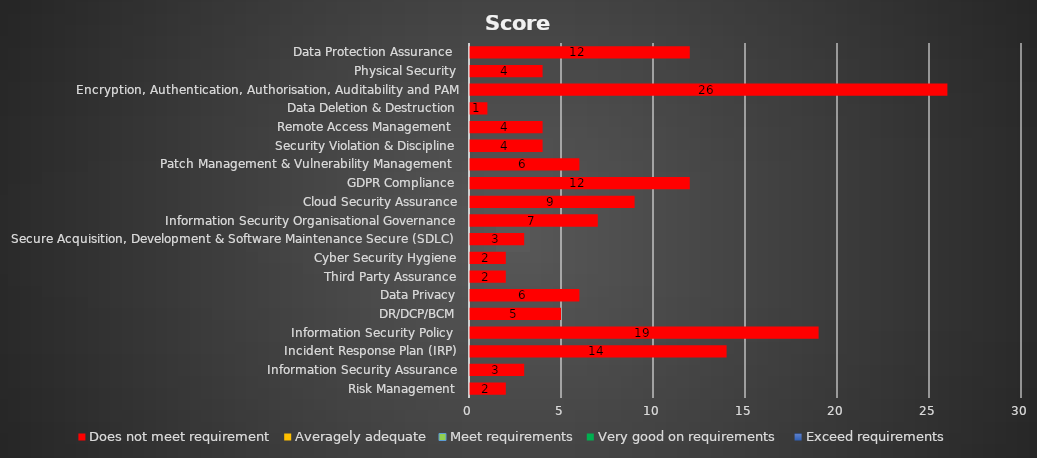
| Category | Does not meet requirement | Averagely adequate | Meet requirements | Very good on requirements  | Exceed requirements  |
|---|---|---|---|---|---|
| Risk Management | 2 | 0 | 0 | 0 | 0 |
| Information Security Assurance | 3 | 0 | 0 | 0 | 0 |
| Incident Response Plan (IRP) | 14 | 0 | 0 | 0 | 0 |
| Information Security Policy  | 19 | 0 | 0 | 0 | 0 |
| DR/DCP/BCM | 5 | 0 | 0 | 0 | 0 |
| Data Privacy | 6 | 0 | 0 | 0 | 0 |
| Third Party Assurance | 2 | 0 | 0 | 0 | 0 |
| Cyber Security Hygiene | 2 | 0 | 0 | 0 | 0 |
| Secure Acquisition, Development & Software Maintenance Secure (SDLC)  | 3 | 0 | 0 | 0 | 0 |
| Information Security Organisational Governance | 7 | 0 | 0 | 0 | 0 |
| Cloud Security Assurance | 9 | 0 | 0 | 0 | 0 |
| GDPR Compliance | 12 | 0 | 0 | 0 | 0 |
| Patch Management & Vulnerability Management  | 6 | 0 | 0 | 0 | 0 |
| Security Violation & Discipline | 4 | 0 | 0 | 0 | 0 |
| Remote Access Management  | 4 | 0 | 0 | 0 | 0 |
| Data Deletion & Destruction | 1 | 0 | 0 | 0 | 0 |
| Encryption, Authentication, Authorisation, Auditability and PAM | 26 | 0 | 0 | 0 | 0 |
| Physical Security | 4 | 0 | 0 | 0 | 0 |
| Data Protection Assurance  | 12 | 0 | 0 | 0 | 0 |